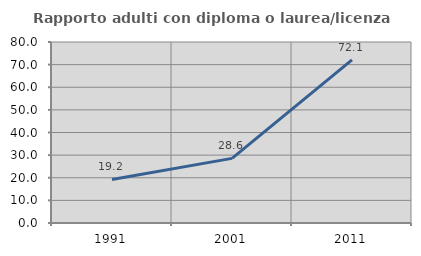
| Category | Rapporto adulti con diploma o laurea/licenza media  |
|---|---|
| 1991.0 | 19.231 |
| 2001.0 | 28.571 |
| 2011.0 | 72.072 |